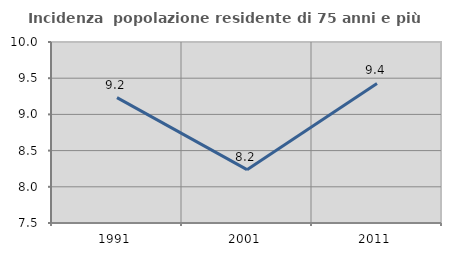
| Category | Incidenza  popolazione residente di 75 anni e più |
|---|---|
| 1991.0 | 9.233 |
| 2001.0 | 8.237 |
| 2011.0 | 9.428 |